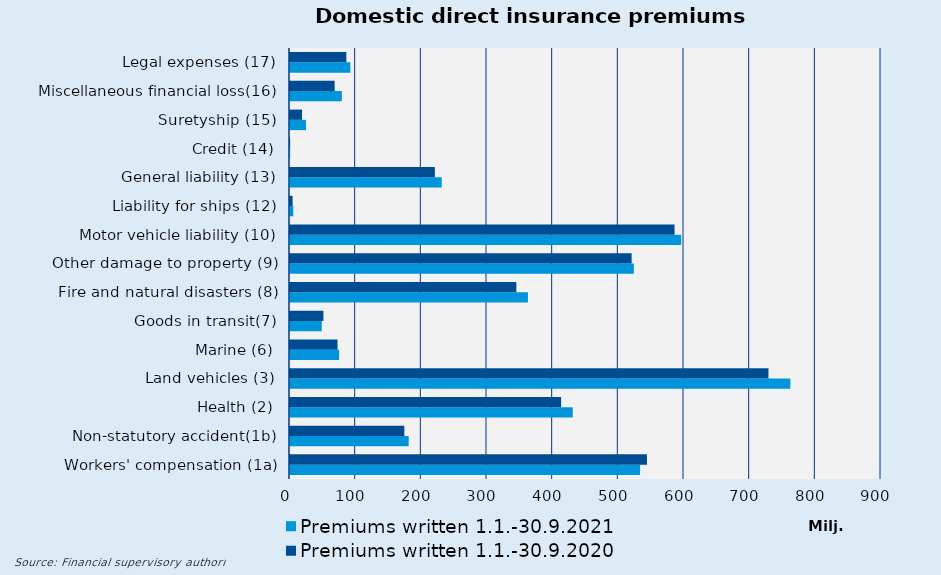
| Category | Premiums written |
|---|---|
| Workers' compensation (1a) | 543609.656 |
| Non-statutory accident(1b) | 174098.328 |
| Health (2) | 412880.783 |
| Land vehicles (3) | 728620.489 |
| Marine (6) | 72357.856 |
| Goods in transit(7) | 50876.686 |
| Fire and natural disasters (8) | 344703.554 |
| Other damage to property (9) | 520254.862 |
| Motor vehicle liability (10) | 585601.942 |
| Liability for ships (12) | 3972.229 |
| General liability (13) | 220617.779 |
| Credit (14) | 188.491 |
| Suretyship (15) | 18370.615 |
| Miscellaneous financial loss(16) | 68006.41 |
| Legal expenses (17) | 85810.009 |